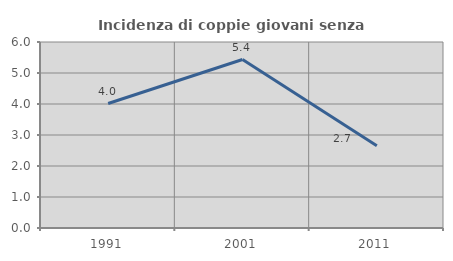
| Category | Incidenza di coppie giovani senza figli |
|---|---|
| 1991.0 | 4.015 |
| 2001.0 | 5.435 |
| 2011.0 | 2.656 |